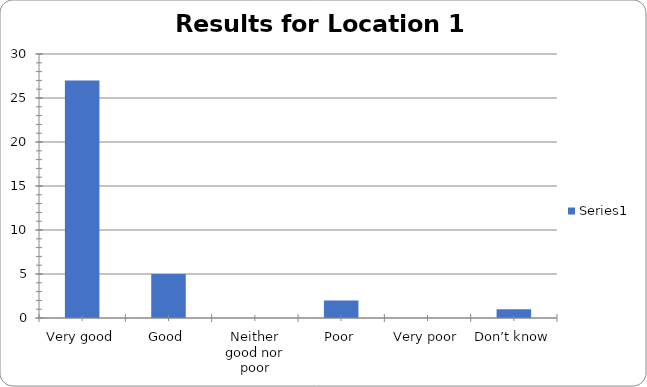
| Category | Series 0 |
|---|---|
| Very good | 27 |
| Good | 5 |
| Neither good nor poor | 0 |
| Poor | 2 |
| Very poor | 0 |
| Don’t know | 1 |